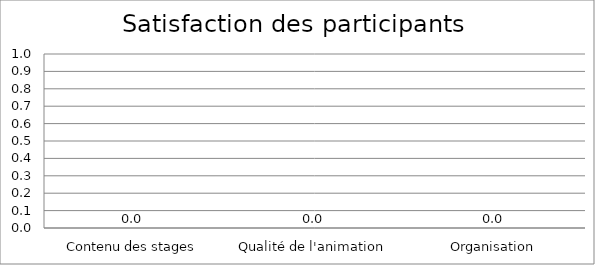
| Category | Series 0 |
|---|---|
| Contenu des stages | 0 |
| Qualité de l'animation | 0 |
| Organisation | 0 |